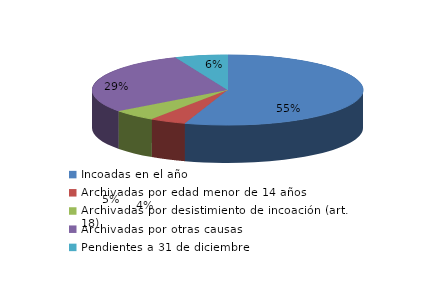
| Category | Series 0 |
|---|---|
| Incoadas en el año | 839 |
| Archivadas por edad menor de 14 años | 66 |
| Archivadas por desistimiento de incoación (art. 18) | 82 |
| Archivadas por otras causas | 441 |
| Pendientes a 31 de diciembre | 95 |